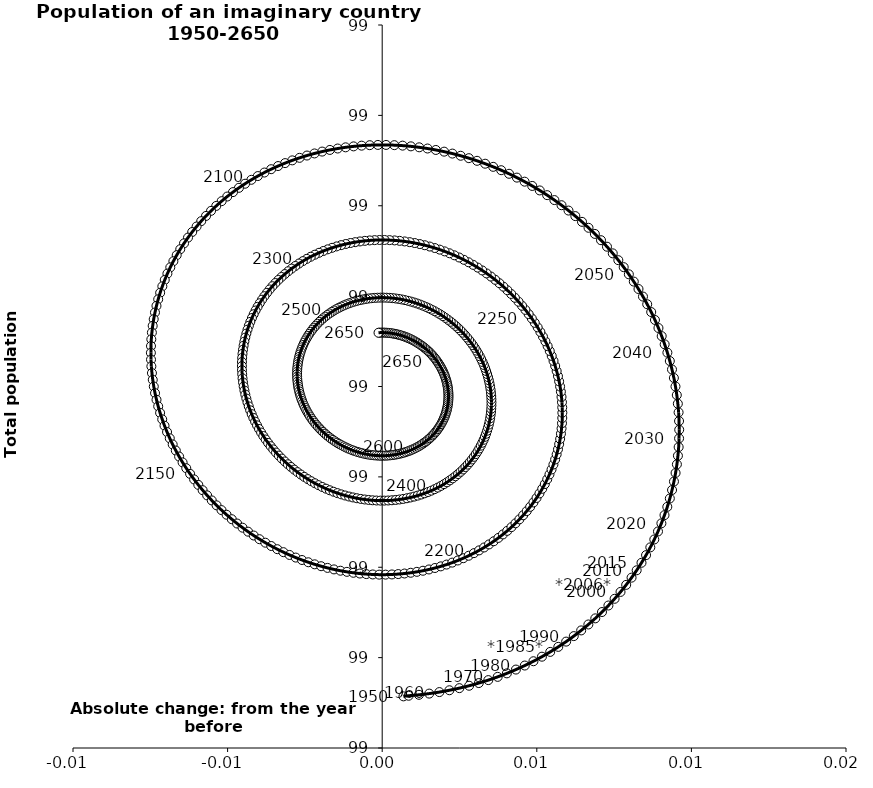
| Category | Series 0 |
|---|---|
| 0.0006872547653102856 | 98.657 |
| 0.0008550317340549896 | 98.658 |
| 0.001189242257922274 | 98.659 |
| 0.0015206077775360427 | 98.66 |
| 0.0018488142153216813 | 98.662 |
| 0.002173552189702832 | 98.664 |
| 0.0024945172981745145 | 98.666 |
| 0.002811410394052416 | 98.669 |
| 0.0031239378565857123 | 98.672 |
| 0.0034318118542628895 | 98.675 |
| 0.0037347506011045084 | 98.679 |
| 0.00403247860563738 | 98.683 |
| 0.004324726912436461 | 98.687 |
| 0.004611233335971576 | 98.691 |
| 0.004891742686524481 | 98.696 |
| 0.0051660069881549475 | 98.701 |
| 0.005433785688389037 | 98.706 |
| 0.005694845859437692 | 98.712 |
| 0.005948962390959878 | 98.718 |
| 0.006195918174086046 | 98.724 |
| 0.006435504276559811 | 98.73 |
| 0.006667520108948111 | 98.737 |
| 0.006891773581756411 | 98.743 |
| 0.007108081253299758 | 98.75 |
| 0.007316268468336773 | 98.758 |
| 0.007516169487253421 | 98.765 |
| 0.007707627605753942 | 98.773 |
| 0.007890495265094444 | 98.781 |
| 0.008064634152596284 | 98.788 |
| 0.008229915292581325 | 98.797 |
| 0.008386219127572758 | 98.805 |
| 0.008533435589725968 | 98.813 |
| 0.008671464162588904 | 98.822 |
| 0.008800213933007228 | 98.831 |
| 0.008919603633295026 | 98.84 |
| 0.009029561673649766 | 98.849 |
| 0.00913002616478309 | 98.858 |
| 0.009220944930866892 | 98.867 |
| 0.009302275512780511 | 98.876 |
| 0.009373985161673204 | 98.885 |
| 0.00943605082301957 | 98.895 |
| 0.009488459111089753 | 98.904 |
| 0.009531206273990733 | 98.914 |
| 0.009564298149328465 | 98.923 |
| 0.00958775011059032 | 98.933 |
| 0.00960158700438285 | 98.943 |
| 0.009605843078539067 | 98.952 |
| 0.00960056190131553 | 98.962 |
| 0.009585796271750269 | 98.971 |
| 0.009561608121309462 | 98.981 |
| 0.00952806840700049 | 98.99 |
| 0.00948525699603664 | 99 |
| 0.009433262542302145 | 99.009 |
| 0.00937218235470283 | 99.019 |
| 0.009302122257572876 | 99.028 |
| 0.00922319644341485 | 99.037 |
| 0.00913552731800138 | 99.047 |
| 0.009039245338151147 | 99.056 |
| 0.008934488842356814 | 99.065 |
| 0.008821403874414102 | 99.074 |
| 0.008700144000322041 | 99.082 |
| 0.008570870118646212 | 99.091 |
| 0.008433750264529749 | 99.1 |
| 0.008288959407629193 | 99.108 |
| 0.008136679244231004 | 99.116 |
| 0.007977097983697945 | 99.124 |
| 0.007810410129501122 | 99.132 |
| 0.0076368162551574414 | 99.14 |
| 0.007456522775299845 | 99.147 |
| 0.0072697417119940155 | 99.155 |
| 0.007076690456770507 | 99.162 |
| 0.006877591528493099 | 99.169 |
| 0.0066726723273049515 | 99.176 |
| 0.006462164885071786 | 99.182 |
| 0.006246305612350511 | 99.189 |
| 0.006025335042394886 | 99.195 |
| 0.005799497572311907 | 99.201 |
| 0.005569041201653135 | 99.206 |
| 0.005334217268789132 | 99.212 |
| 0.005095280185237527 | 99.217 |
| 0.004852487168335529 | 99.222 |
| 0.004606097972427392 | 99.227 |
| 0.004356374618886605 | 99.231 |
| 0.004103581125214362 | 99.235 |
| 0.003847983233548291 | 99.239 |
| 0.003589848138837226 | 99.243 |
| 0.0033294442168454452 | 99.247 |
| 0.0030670407524127086 | 99.25 |
| 0.0028029076681761467 | 99.253 |
| 0.0025373152539742705 | 99.255 |
| 0.0022705338972528466 | 99.258 |
| 0.0020028338147213276 | 99.26 |
| 0.0017344847854943168 | 99.262 |
| 0.0014657558860662334 | 99.263 |
| 0.0011969152272186534 | 99.265 |
| 0.0009282296932155987 | 99.266 |
| 0.0006599646835709905 | 99.267 |
| 0.00039238385752327076 | 99.267 |
| 0.00012574888152983021 | 99.267 |
| -0.0001396808200482269 | 99.267 |
| -0.00040364831072281504 | 99.267 |
| -0.0006658993840318317 | 99.266 |
| -0.0009261828017343987 | 99.266 |
| -0.0011842505278920612 | 99.265 |
| -0.0014398579586440974 | 99.263 |
| -0.001692764147385617 | 99.262 |
| -0.0019427320252063396 | 99.26 |
| -0.0021895286164195227 | 99.258 |
| -0.0024329252489678765 | 99.256 |
| -0.0026726977594506707 | 99.253 |
| -0.0029086266927151883 | 99.25 |
| -0.0031404974957922605 | 99.247 |
| -0.003368100705984034 | 99.244 |
| -0.0035912321329760744 | 99.24 |
| -0.003809693034845907 | 99.237 |
| -0.004023290287733516 | 99.233 |
| -0.0042318365491595955 | 99.229 |
| -0.004435150414799693 | 99.224 |
| -0.004633056568543736 | 99.22 |
| -0.0048253859258267084 | 99.215 |
| -0.005011975770045751 | 99.21 |
| -0.005192669881992629 | 99.205 |
| -0.005367318662216292 | 99.2 |
| -0.005535779246201855 | 99.194 |
| -0.00569791561230204 | 99.189 |
| -0.0058535986823713415 | 99.183 |
| -0.006002706414989234 | 99.177 |
| -0.006145123891272419 | 99.171 |
| -0.006280743393226373 | 99.165 |
| -0.006409464474479876 | 99.158 |
| -0.0065311940235588395 | 99.152 |
| -0.006645846319564441 | 99.145 |
| -0.006753343080198704 | 99.139 |
| -0.0068536135022227995 | 99.132 |
| -0.006946594294298336 | 99.125 |
| -0.007032229702232939 | 99.118 |
| -0.007110471526594608 | 99.111 |
| -0.007181279132815632 | 99.104 |
| -0.007244619453700807 | 99.096 |
| -0.007300466984411003 | 99.089 |
| -0.007348803770064194 | 99.082 |
| -0.007389619385861579 | 99.075 |
| -0.007422910909802738 | 99.067 |
| -0.007448682888224312 | 99.06 |
| -0.007466947294020088 | 99.052 |
| -0.007477723477741449 | 99.045 |
| -0.0074810381116279245 | 99.037 |
| -0.007476925126667311 | 99.03 |
| -0.007465425642806167 | 99.022 |
| -0.007446587892303569 | 99.015 |
| -0.007420467136526554 | 99.007 |
| -0.007387125576144626 | 99 |
| -0.007346632254858321 | 98.993 |
| -0.007299062956924729 | 98.985 |
| -0.007244500098430251 | 98.978 |
| -0.007183032612559259 | 98.971 |
| -0.007114755829029207 | 98.964 |
| -0.007039771347727708 | 98.957 |
| -0.006958186906764752 | 98.95 |
| -0.006870116245174529 | 98.943 |
| -0.0067756789602881895 | 98.936 |
| -0.006675000360012007 | 98.929 |
| -0.006568211310245431 | 98.922 |
| -0.006455448077502979 | 98.916 |
| -0.006336852167009965 | 98.91 |
| -0.0062125701563431335 | 98.903 |
| -0.006082753524964346 | 98.897 |
| -0.005947558479689974 | 98.891 |
| -0.005807145776387301 | 98.885 |
| -0.005661680538025848 | 98.88 |
| -0.005511332069289665 | 98.874 |
| -0.005356273668034817 | 98.869 |
| -0.00519668243368443 | 98.863 |
| -0.005032739072831305 | 98.858 |
| -0.0048646277021973106 | 98.853 |
| -0.0046925356492835135 | 98.848 |
| -0.004516653250746572 | 98.844 |
| -0.004337173648806925 | 98.839 |
| -0.004154292586001418 | 98.835 |
| -0.003968208198230627 | 98.831 |
| -0.003779120806541414 | 98.827 |
| -0.0035872327078294575 | 98.823 |
| -0.0033927479645399217 | 98.82 |
| -0.003195872193714422 | 98.817 |
| -0.0029968123555406123 | 98.814 |
| -0.0027957765416388725 | 98.811 |
| -0.002592973763270834 | 98.808 |
| -0.00238861373968291 | 98.806 |
| -0.00218290668684773 | 98.803 |
| -0.0019760631066958467 | 98.801 |
| -0.0017682935771716757 | 98.799 |
| -0.001559808543262875 | 98.798 |
| -0.0013508181091737015 | 98.796 |
| -0.0011415318318697132 | 98.795 |
| -0.0009321585162282986 | 98.794 |
| -0.0007229060119442465 | 98.793 |
| -0.0005139810123608868 | 98.792 |
| -0.00030558885550391324 | 98.792 |
| -9.793332740315464e-05 | 98.792 |
| 0.00010878353203480629 | 98.792 |
| 0.0003143616204752675 | 98.792 |
| 0.0005186029617334498 | 98.792 |
| 0.0007213118912545724 | 98.793 |
| 0.0009222952384746463 | 98.794 |
| 0.0011213625057067134 | 98.795 |
| 0.001318326043531215 | 98.796 |
| 0.0015130012225270661 | 98.798 |
| 0.0017052066010307954 | 98.799 |
| 0.0018947640890516482 | 98.801 |
| 0.0020814991079731726 | 98.803 |
| 0.0022652407459489154 | 98.805 |
| 0.0024458219089567024 | 98.807 |
| 0.0026230794672841284 | 98.81 |
| 0.002796854397352888 | 98.813 |
| 0.00296699191879668 | 98.816 |
| 0.003133341626607944 | 98.819 |
| 0.003295757618317907 | 98.822 |
| 0.0034540986160891407 | 98.825 |
| 0.0036082280835998404 | 98.829 |
| 0.0037580143376558794 | 98.832 |
| 0.0039033306544453694 | 98.836 |
| 0.004044055370329147 | 98.84 |
| 0.004180071977124555 | 98.844 |
| 0.004311269211854096 | 98.849 |
| 0.004437541140738688 | 98.853 |
| 0.00455878723761316 | 98.858 |
| 0.004674912456536617 | 98.862 |
| 0.004785827298597667 | 98.867 |
| 0.004891447872914512 | 98.872 |
| 0.004991695951787278 | 98.877 |
| 0.005086499019945734 | 98.882 |
| 0.00517579031784976 | 98.887 |
| 0.00525950887920601 | 98.892 |
| 0.005337599562395212 | 98.897 |
| 0.0054100130760801335 | 98.903 |
| 0.005476705998837872 | 98.908 |
| 0.0055376407929159654 | 98.914 |
| 0.0055927858120981 | 98.919 |
| 0.005642115303594153 | 98.925 |
| 0.005685609404245895 | 98.931 |
| 0.005723254130771238 | 98.936 |
| 0.005755041364302826 | 98.942 |
| 0.005780968829220967 | 98.948 |
| 0.005801040066202745 | 98.954 |
| 0.005815264399736009 | 98.959 |
| 0.005823656900055596 | 98.965 |
| 0.005826238339523115 | 98.971 |
| 0.0058230351436137084 | 98.977 |
| 0.005814079336573741 | 98.983 |
| 0.005799408481735213 | 98.988 |
| 0.005779065616685841 | 98.994 |
| 0.005753099183351651 | 99 |
| 0.005721562953020509 | 99.006 |
| 0.005684515946541069 | 99.011 |
| 0.005642022349618969 | 99.017 |
| 0.0055941514234874035 | 99.023 |
| 0.005540977411008896 | 99.028 |
| 0.005482579438250923 | 99.034 |
| 0.0054190414117485375 | 99.039 |
| 0.005350451911539267 | 99.045 |
| 0.005276904080112388 | 99.05 |
| 0.0051984955073720585 | 99.055 |
| 0.005115328111791939 | 99.06 |
| 0.005027508017839466 | 99.065 |
| 0.004935145429875831 | 99.07 |
| 0.004838354502645359 | 99.075 |
| 0.004737253208475067 | 99.08 |
| 0.004631963201347844 | 99.085 |
| 0.004522609678062395 | 99.089 |
| 0.0044093212365154955 | 99.094 |
| 0.004292229731326813 | 99.098 |
| 0.0041714701270123555 | 99.102 |
| 0.0040471803487278635 | 99.107 |
| 0.003919501130908998 | 99.111 |
| 0.0037885758638225298 | 99.114 |
| 0.00365455043825591 | 99.118 |
| 0.0035175730885370626 | 99.122 |
| 0.0033777942340051936 | 99.125 |
| 0.0032353663190889392 | 99.128 |
| 0.0030904436521694834 | 99.132 |
| 0.0029431822434560218 | 99.135 |
| 0.0027937396419233096 | 99.137 |
| 0.002642274771552877 | 99.14 |
| 0.0024889477670555493 | 99.143 |
| 0.002333919809210272 | 99.145 |
| 0.0021773529599258268 | 99.147 |
| 0.0020194099973167567 | 99.15 |
| 0.0018602542509214004 | 99.151 |
| 0.0017000494370904562 | 99.153 |
| 0.001538959494894243 | 99.155 |
| 0.0013771484226055009 | 99.156 |
| 0.0012147801149353654 | 99.158 |
| 0.001052018201207261 | 99.159 |
| 0.0008890258845539734 | 99.16 |
| 0.000725965782386595 | 99.161 |
| 0.000562999768192185 | 99.161 |
| 0.0004002888149088335 | 99.162 |
| 0.00023799283996339682 | 99.162 |
| 7.6270552071378e-05 | 99.162 |
| -8.472069993104014e-05 | 99.162 |
| -0.0002448250761943882 | 99.162 |
| -0.0004038883927037773 | 99.162 |
| -0.0005617582657464482 | 99.161 |
| -0.0007182842539421586 | 99.161 |
| -0.0008733179975521921 | 99.16 |
| -0.0010267133550527774 | 99.159 |
| -0.0011783265368876528 | 99.158 |
| -0.0013280162361795078 | 99.156 |
| -0.0014756437562937208 | 99.155 |
| -0.0016210731352543917 | 99.153 |
| -0.0017641712667924025 | 99.152 |
| -0.0019048080179473459 | 99.15 |
| -0.0020428563431735824 | 99.148 |
| -0.0021781923947941095 | 99.146 |
| -0.0023106956297311854 | 99.144 |
| -0.0024402489124355498 | 99.141 |
| -0.0025667386139573978 | 99.139 |
| -0.0026900547070098924 | 99.136 |
| -0.0028100908570038996 | 99.133 |
| -0.0029267445089615762 | 99.13 |
| -0.0030399169702661766 | 99.127 |
| -0.003149513489198341 | 99.124 |
| -0.0032554433290883367 | 99.121 |
| -0.00335761983821925 | 99.118 |
| -0.003455960515317713 | 99.114 |
| -0.0035503870705113627 | 99.111 |
| -0.0036408254819377817 | 99.107 |
| -0.0037272060477917535 | 99.104 |
| -0.003809463433782412 | 99.1 |
| -0.0038875367161068652 | 99.096 |
| -0.003961369419819505 | 99.092 |
| -0.0040309095525543626 | 99.088 |
| -0.004096109633699996 | 99.084 |
| -0.004156926718920317 | 99.08 |
| -0.004213322420078214 | 99.076 |
| -0.004265262920540636 | 99.072 |
| -0.004312718985893582 | 99.067 |
| -0.004355665970017242 | 99.063 |
| -0.004394083816613659 | 99.059 |
| -0.004427957056257981 | 99.054 |
| -0.004457274798760125 | 99.05 |
| -0.004482030721135288 | 99.045 |
| -0.004502223051112253 | 99.041 |
| -0.004517854546179478 | 99.036 |
| -0.004528932468282676 | 99.032 |
| -0.0045354685541099116 | 99.027 |
| -0.004537478981177401 | 99.023 |
| -0.00453498432969468 | 99.018 |
| -0.004528009540166522 | 99.014 |
| -0.004516583866930546 | 99.009 |
| -0.004500740827694472 | 99.004 |
| -0.004480518149073021 | 99 |
| -0.0044559577082097235 | 98.996 |
| -0.004427105470554693 | 98.991 |
| -0.004394011423983102 | 98.987 |
| -0.004356729509233048 | 98.982 |
| -0.004315317546677022 | 98.978 |
| -0.004269837159760925 | 98.974 |
| -0.004220353694968537 | 98.969 |
| -0.0041669361384890635 | 98.965 |
| -0.004109657029779612 | 98.961 |
| -0.004048592371937332 | 98.957 |
| -0.003983821539137011 | 98.953 |
| -0.003915427181190978 | 98.949 |
| -0.003843495125352092 | 98.945 |
| -0.003768114275437995 | 98.941 |
| -0.00368937650836898 | 98.938 |
| -0.0036073765683681813 | 98.934 |
| -0.0035222119588027567 | 98.93 |
| -0.00343398283180818 | 98.927 |
| -0.00334279187588038 | 98.924 |
| -0.0032487442014783596 | 98.92 |
| -0.003151947224822038 | 98.917 |
| -0.003052510549998999 | 98.914 |
| -0.002950545849472519 | 98.911 |
| -0.0028461667430903503 | 98.908 |
| -0.0027394886758642656 | 98.905 |
| -0.002630628794499046 | 98.903 |
| -0.002519705822827234 | 98.9 |
| -0.0024068399363486037 | 98.898 |
| -0.002292152635924083 | 98.895 |
| -0.002175766620823083 | 98.893 |
| -0.0020578056611739726 | 98.891 |
| -0.0019383944700095412 | 98.889 |
| -0.0018176585750353524 | 98.887 |
| -0.0016957241902062492 | 98.885 |
| -0.0015727180872531221 | 98.884 |
| -0.0014487674673304696 | 98.882 |
| -0.0013239998328700153 | 98.881 |
| -0.0011985428597398595 | 98.879 |
| -0.0010725242699294313 | 98.878 |
| -0.0009460717047744538 | 98.877 |
| -0.000819312598906663 | 98.876 |
| -0.0006923740550632829 | 98.876 |
| -0.0005653827197988903 | 98.875 |
| -0.000438464660334148 | 98.874 |
| -0.0003117452425129841 | 98.874 |
| -0.00018534901013111948 | 98.874 |
| -5.939956567857507e-05 | 98.874 |
| 6.598054745410309e-05 | 98.874 |
| 0.00019066996105721046 | 98.874 |
| 0.0003145485965063699 | 98.874 |
| 0.00043749777726276307 | 98.874 |
| 0.0005594003394406855 | 98.875 |
| 0.0006801407403642656 | 98.876 |
| 0.0007996051649072911 | 98.876 |
| 0.0009176816296445622 | 98.877 |
| 0.0010342600846655614 | 98.878 |
| 0.0011492325129296432 | 98.879 |
| 0.0012624930271485368 | 98.88 |
| 0.0013739379640540506 | 98.882 |
| 0.0014834659759799251 | 98.883 |
| 0.0015909781197649409 | 98.885 |
| 0.0016963779427499048 | 98.886 |
| 0.0017995715658685185 | 98.888 |
| 0.0019004677638889689 | 98.89 |
| 0.0019989780424936043 | 98.892 |
| 0.0020950167123245933 | 98.894 |
| 0.0021885009599387217 | 98.896 |
| 0.0022793509154297453 | 98.898 |
| 0.002367489716917248 | 98.901 |
| 0.00245284357168174 | 98.903 |
| 0.0025353418139317796 | 98.906 |
| 0.002614916959259972 | 98.908 |
| 0.002691504755595986 | 98.911 |
| 0.002765044230720548 | 98.914 |
| 0.0028354777363617245 | 98.916 |
| 0.0029027509886887515 | 98.919 |
| 0.0029668131053099955 | 98.922 |
| 0.0030276166387253056 | 98.925 |
| 0.003085117606190124 | 98.928 |
| 0.0031392755160197794 | 98.931 |
| 0.003190053390270009 | 98.935 |
| 0.003237417783864771 | 98.938 |
| 0.0032813388000860755 | 98.941 |
| 0.0033217901025253127 | 98.944 |
| 0.003358748923382393 | 98.948 |
| 0.003392196068240594 | 98.951 |
| 0.0034221159172673765 | 98.954 |
| 0.0034484964228269632 | 98.958 |
| 0.0034713291036396754 | 98.961 |
| 0.0034906090353672425 | 98.965 |
| 0.0035063348377661896 | 98.968 |
| 0.0035185086583666703 | 98.972 |
| 0.003527136152769117 | 98.975 |
| 0.003532226461537391 | 98.979 |
| 0.003533792183716855 | 98.982 |
| 0.0035318493471834245 | 98.986 |
| 0.003526417375631752 | 98.989 |
| 0.003517519052373075 | 98.993 |
| 0.003505180481013781 | 98.997 |
| 0.003489431043064428 | 99 |
| 0.003470303352486326 | 99.003 |
| 0.0034478332072040985 | 99.007 |
| 0.0034220595378258167 | 99.01 |
| 0.003393024353421481 | 99.014 |
| 0.003360772684551705 | 99.017 |
| 0.0033253525236105475 | 99.021 |
| 0.0032868147624753874 | 99.024 |
| 0.003245213127662794 | 99.027 |
| 0.0032006041129548635 | 99.03 |
| 0.003153046909602608 | 99.033 |
| 0.003102603334291132 | 99.037 |
| 0.0030493377547742284 | 99.04 |
| 0.0029933170133631393 | 99.043 |
| 0.0029346103484115815 | 99.046 |
| 0.0028732893137544124 | 99.049 |
| 0.0028094276962775666 | 99.051 |
| 0.0027431014316618985 | 99.054 |
| 0.0026743885184643545 | 99.057 |
| 0.0026033689305791086 | 99.06 |
| 0.0025301245281070806 | 99.062 |
| 0.0024547389668896358 | 99.065 |
| 0.0023772976066780416 | 99.067 |
| 0.0022978874180594744 | 99.069 |
| 0.0022165968882674747 | 99.072 |
| 0.002133515925976326 | 99.074 |
| 0.002048735765129095 | 99.076 |
| 0.0019623488679272327 | 99.078 |
| 0.0018744488271522641 | 99.08 |
| 0.0017851302677769354 | 99.082 |
| 0.0016944887480789816 | 99.083 |
| 0.0016026206603285686 | 99.085 |
| 0.001509623131148885 | 99.087 |
| 0.0014155939215996227 | 99.088 |
| 0.001320631327203614 | 99.089 |
| 0.0012248340779024147 | 99.091 |
| 0.0011283012380474133 | 99.092 |
| 0.0010311321066254209 | 99.093 |
| 0.0009334261177045278 | 99.094 |
| 0.0008352827412849706 | 99.095 |
| 0.000736801384519481 | 99.096 |
| 0.00063808129360865 | 99.096 |
| 0.0005392214562647268 | 99.097 |
| 0.0004403205049143821 | 99.097 |
| 0.00034147662081807084 | 99.098 |
| 0.0002427874389852036 | 99.098 |
| 0.00014434995422618613 | 99.098 |
| 4.626042826316734e-05 | 99.098 |
| -5.138570201523862e-05 | 99.098 |
| -0.000148493914977621 | 99.098 |
| -0.00024497069328077714 | 99.098 |
| -0.0003407236115222645 | 99.098 |
| -0.0004356614224008126 | 99.097 |
| -0.0005296941411927492 | 99.097 |
| -0.0006227331285799664 | 99.096 |
| -0.0007146911717796911 | 99.096 |
| -0.000805482563833948 | 99.095 |
| -0.0008950231810018749 | 99.094 |
| -0.0009832305581696232 | 99.093 |
| -0.0010700239622920549 | 99.092 |
| -0.0011553244637525495 | 99.091 |
| -0.0012390550055272342 | 99.09 |
| -0.0013211404701962692 | 99.088 |
| -0.001401507744695607 | 99.087 |
| -0.001480085782723961 | 99.086 |
| -0.001556805664833405 | 99.084 |
| -0.0016316006561041263 | 99.083 |
| -0.0017044062613464916 | 99.081 |
| -0.0017751602778304232 | 99.079 |
| -0.0018438028454497157 | 99.077 |
| -0.001910276494378138 | 99.075 |
| -0.001974526190046788 | 99.074 |
| -0.002036499375542178 | 99.071 |
| -0.002096146011297151 | 99.069 |
| -0.0021534186121101584 | 99.067 |
| -0.002208272281464474 | 99.065 |
| -0.002260664743047869 | 99.063 |
| -0.002310556369636174 | 99.061 |
| -0.0023579102090849346 | 99.058 |
| -0.002402692007571261 | 99.056 |
| -0.0024448702301498315 | 99.053 |
| -0.0024844160783814573 | 99.051 |
| -0.0025213035052047417 | 99.048 |
| -0.0025555092270295177 | 99.046 |
| -0.0025870127330449577 | 99.043 |
| -0.002615796291671302 | 99.041 |
| -0.002641844954275996 | 99.038 |
| -0.002665146556125819 | 99.035 |
| -0.002685691714518157 | 99.033 |
| -0.0027034738242122103 | 99.03 |
| -0.002718489050138828 | 99.027 |
| -0.002730736317360538 | 99.025 |
| -0.0027402172983812534 | 99.022 |
| -0.0027469363977843386 | 99.019 |
| -0.002750900734227457 | 99.016 |
| -0.0027521201198865697 | 99.014 |
| -0.00275060703727803 | 99.011 |
| -0.002746376613579571 | 99.008 |
| -0.002739446592457284 | 99.005 |
| -0.002729837303419913 | 99.003 |
| -0.0027175716288141416 | 99 |
| -0.002702674968411145 | 98.997 |
| -0.002685175201669665 | 98.995 |
| -0.002665102647775086 | 98.992 |
| -0.0026424900234189863 | 98.989 |
| -0.0026173723984541652 | 98.987 |
| -0.0025897871493825164 | 98.984 |
| -0.002559773910832064 | 98.981 |
| -0.00252737452505869 | 98.979 |
| -0.0024926329894654486 | 98.976 |
| -0.0024555954022531523 | 98.974 |
| -0.002416309906308811 | 98.971 |
| -0.002374826631267979 | 98.969 |
| -0.0023311976339854823 | 98.967 |
| -0.0022854768373505863 | 98.964 |
| -0.00223771996754607 | 98.962 |
| -0.0021879844898435863 | 98.96 |
| -0.0021363295430205653 | 98.958 |
| -0.0020828158724199852 | 98.956 |
| -0.002027505761759585 | 98.954 |
| -0.0019704629637615767 | 98.952 |
| -0.0019117526296454912 | 98.95 |
| -0.0018514412376759992 | 98.948 |
| -0.0017895965205951825 | 98.946 |
| -0.0017262873923300504 | 98.944 |
| -0.0016615838738474054 | 98.943 |
| -0.0015955570181915846 | 98.941 |
| -0.0015282788350035048 | 98.939 |
| -0.0014598222144144302 | 98.938 |
| -0.0013902608504281488 | 98.936 |
| -0.0013196691639123515 | 98.935 |
| -0.001248122225234738 | 98.934 |
| -0.0011756956766717508 | 98.933 |
| -0.0011024656546467781 | 98.931 |
| -0.0010285087117836156 | 98.93 |
| -0.0009539017390025606 | 98.929 |
| -0.0008787218877301939 | 98.928 |
| -0.0008030464920878444 | 98.928 |
| -0.000726952991406904 | 98.927 |
| -0.0006505188529999373 | 98.926 |
| -0.0005738214952302201 | 98.926 |
| -0.0004969382111283949 | 98.925 |
| -0.00041994609238571456 | 98.925 |
| -0.00034292195402940706 | 98.924 |
| -0.0002659422596948957 | 98.924 |
| -0.0001890830476014571 | 98.924 |
| -0.00011241985739474103 | 98.923 |
| -3.602765775667649e-05 | 98.923 |
| 4.001922497565147e-05 | 98.923 |
| 0.00011564717726741947 | 98.923 |
| 0.00019078336774924765 | 98.924 |
| 0.00026535581546482945 | 98.924 |
| 0.0003392934569248496 | 98.924 |
| 0.0004125262119458739 | 98.925 |
| 0.00048498504818184074 | 98.925 |
| 0.0005566020442344666 | 98.926 |
| 0.0006273104514704642 | 98.926 |
| 0.0006970447542329339 | 98.927 |
| 0.0007657407286387752 | 98.928 |
| 0.0008333354997418496 | 98.928 |
| 0.0008997675970690011 | 98.929 |
| 0.0009649770085715659 | 98.93 |
| 0.0010289052327365766 | 98.931 |
| 0.0010914953290495077 | 98.932 |
| 0.0011526919665953983 | 98.933 |
| 0.0012124414708623021 | 98.934 |
| 0.0012706918686404833 | 98.936 |
| 0.0013273929310102517 | 98.937 |
| 0.00138249621444686 | 98.938 |
| 0.0014359550998648274 | 98.94 |
| 0.0014877248297082701 | 98.941 |
| 0.0015377625430019748 | 98.943 |
| 0.0015860273083916354 | 98.944 |
| 0.0016324801550311463 | 98.946 |
| 0.0016770841013951099 | 98.948 |
| 0.0017198041820378762 | 98.949 |
| 0.0017606074721498999 | 98.951 |
| 0.001799463110003785 | 98.953 |
| 0.0018363423172402804 | 98.955 |
| 0.001871218416980014 | 98.956 |
| 0.0019040668497538604 | 98.958 |
| 0.0019348651873158929 | 98.96 |
| 0.0019635931442110177 | 98.962 |
| 0.0019902325871612447 | 98.964 |
| 0.0020147675423132227 | 98.966 |
| 0.0020371842003044094 | 98.968 |
| 0.002057470919140769 | 98.97 |
| 0.0020756182249144217 | 98.972 |
| 0.0020916188103541344 | 98.974 |
| 0.002105467531308136 | 98.977 |
| 0.002117161401024248 | 98.979 |
| 0.002126699582319702 | 98.981 |
| 0.002134083377761442 | 98.983 |
| 0.0021393162176437386 | 98.985 |
| 0.002142403645969182 | 98.987 |
| 0.0021433533044756814 | 98.989 |
| 0.002142174914553152 | 98.991 |
| 0.002138880257263054 | 98.994 |
| 0.0021334831513897257 | 98.996 |
| 0.0021259994295590445 | 98.998 |
| 0.002116446912573622 | 99 |
| 0.0021048453817869017 | 99.002 |
| 0.0020912165497435353 | 99.004 |
| 0.0020755840290505034 | 99.006 |
| 0.002057973299500304 | 99.008 |
| 0.0020384116735101543 | 99.01 |
| 0.002016928259919837 | 99.012 |
| 0.00199355392623346 | 99.014 |
| 0.0019683212592340738 | 99.016 |
| 0.0019412645241061455 | 99.018 |
| 0.0019124196221866896 | 99.02 |
| 0.0018818240471816239 | 99.022 |
| 0.0018495168400889384 | 99.024 |
| 0.0018155385428428872 | 99.026 |
| 0.0017799311506223603 | 99.028 |
| 0.0017427380630152811 | 99.029 |
| 0.0017040040340390306 | 99.031 |
| 0.0016637751210026863 | 99.033 |
| 0.0016220986324313458 | 99.035 |
| 0.0015790230749388456 | 99.036 |
| 0.0015345980991838815 | 99.038 |
| 0.0014888744450161084 | 99.039 |
| 0.0014419038857127475 | 99.041 |
| 0.0013937391716183356 | 99.042 |
| 0.0013444339729602461 | 99.043 |
| 0.0012940428220886702 | 99.045 |
| 0.0012426210551979011 | 99.046 |
| 0.0011902247534507637 | 99.047 |
| 0.0011369106837335607 | 99.048 |
| 0.0010827362389917994 | 99.05 |
| 0.0010277593782461736 | 99.051 |
| 0.0009720385663740672 | 99.052 |
| 0.0009156327136494724 | 99.053 |
| 0.000858601115155011 | 99.053 |
| 0.0008010033901300062 | 99.054 |
| 0.0007428994213043438 | 99.055 |
| 0.0006843492942678608 | 99.056 |
| 0.0006254132368823662 | 99.056 |
| 0.0005661515589636679 | 99.057 |
| 0.0005066245921199197 | 99.058 |
| 0.0004468926298315523 | 99.058 |
| 0.00038701586796463516 | 99.058 |
| 0.00032705434559687774 | 99.059 |
| 0.0002670678863339049 | 99.059 |
| 0.0002071160401015959 | 99.059 |
| 0.00014725802553527956 | 99.059 |
| 8.755267296578495e-05 | 99.06 |
| 2.8058368073402562e-05 | 99.06 |
| -3.116700374761194e-05 | 99.06 |
| -9.006611221451521e-05 | 99.06 |
| -0.00011942697071276598 | 99.059 |